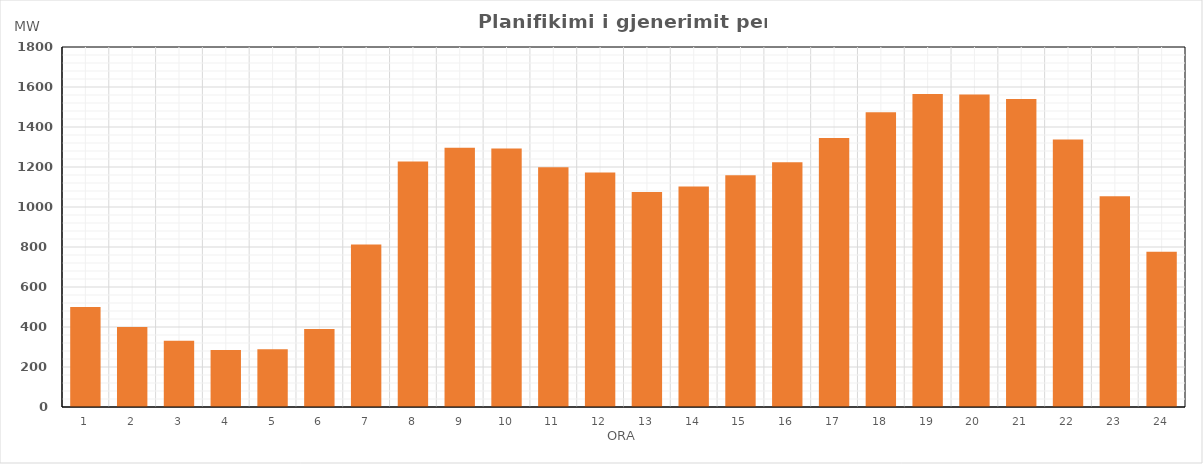
| Category | Max (MW) |
|---|---|
| 0 | 500.02 |
| 1 | 400.02 |
| 2 | 331.02 |
| 3 | 285.02 |
| 4 | 289.02 |
| 5 | 390.02 |
| 6 | 812.286 |
| 7 | 1227.02 |
| 8 | 1296.02 |
| 9 | 1292.703 |
| 10 | 1198.459 |
| 11 | 1172.405 |
| 12 | 1075.202 |
| 13 | 1102.463 |
| 14 | 1158.452 |
| 15 | 1224.242 |
| 16 | 1345.392 |
| 17 | 1473.942 |
| 18 | 1564.743 |
| 19 | 1562.779 |
| 20 | 1539.595 |
| 21 | 1337.945 |
| 22 | 1053.799 |
| 23 | 776.431 |